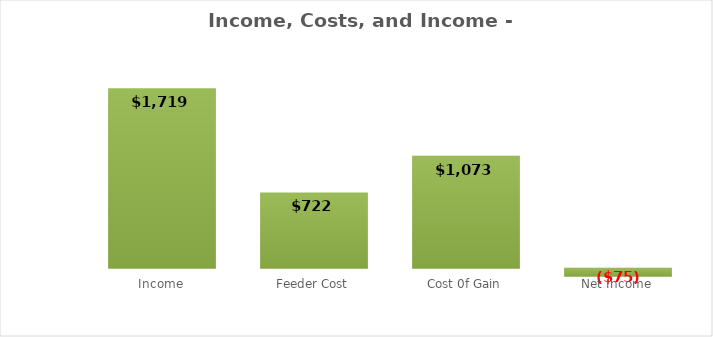
| Category |  $/Head |
|---|---|
| Income | 1719.24 |
| Feeder Cost | 722.167 |
| Cost 0f Gain | 1072.555 |
| Net Income | -75.482 |